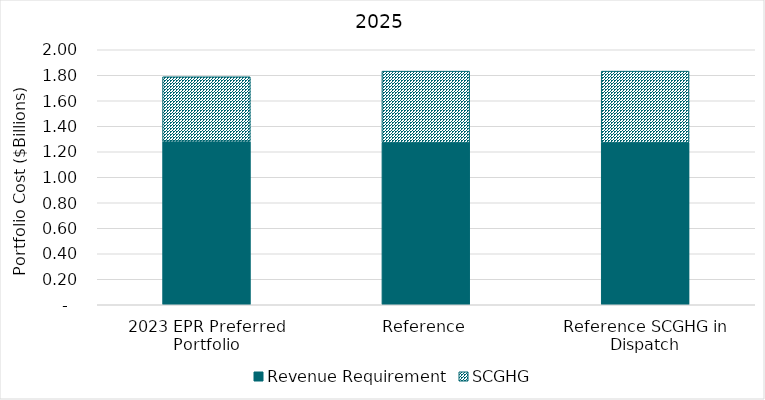
| Category | Revenue Requirement | SCGHG |
|---|---|---|
| 2023 EPR Preferred Portfolio | 1.283 | 0.505 |
| Reference | 1.272 | 0.561 |
| Reference SCGHG in Dispatch | 1.272 | 0.561 |